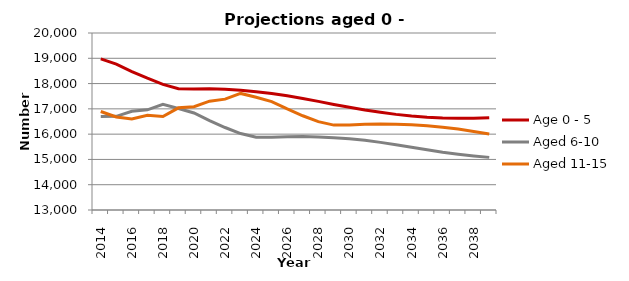
| Category | Age 0 - 5 | Aged 6-10 | Aged 11-15 |
|---|---|---|---|
| 2014.0 | 18974 | 16701 | 16895 |
| 2015.0 | 18769 | 16704 | 16677 |
| 2016.0 | 18477 | 16902 | 16599 |
| 2017.0 | 18213 | 16963 | 16745 |
| 2018.0 | 17967 | 17183 | 16697 |
| 2019.0 | 17797 | 17016 | 17040 |
| 2020.0 | 17784 | 16838 | 17082 |
| 2021.0 | 17791 | 16538 | 17303 |
| 2022.0 | 17776 | 16262 | 17385 |
| 2023.0 | 17734 | 16023 | 17610 |
| 2024.0 | 17677 | 15876 | 17457 |
| 2025.0 | 17608 | 15877 | 17287 |
| 2026.0 | 17517 | 15901 | 16996 |
| 2027.0 | 17411 | 15905 | 16727 |
| 2028.0 | 17296 | 15887 | 16494 |
| 2029.0 | 17176 | 15856 | 16357 |
| 2030.0 | 17063 | 15815 | 16363 |
| 2031.0 | 16955 | 15754 | 16395 |
| 2032.0 | 16862 | 15674 | 16405 |
| 2033.0 | 16782 | 15580 | 16396 |
| 2034.0 | 16716 | 15479 | 16370 |
| 2035.0 | 16668 | 15380 | 16333 |
| 2036.0 | 16637 | 15287 | 16276 |
| 2037.0 | 16625 | 15208 | 16199 |
| 2038.0 | 16630 | 15139 | 16107 |
| 2039.0 | 16653 | 15081 | 16009 |